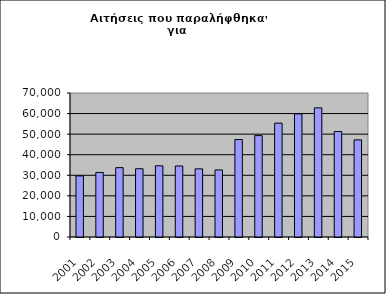
| Category | Series 1 |
|---|---|
| 2001.0 | 29694 |
| 2002.0 | 31386 |
| 2003.0 | 33712 |
| 2004.0 | 33179 |
| 2005.0 | 34612 |
| 2006.0 | 34527 |
| 2007.0 | 33131 |
| 2008.0 | 32607 |
| 2009.0 | 47377 |
| 2010.0 | 49282 |
| 2011.0 | 55358 |
| 2012.0 | 59832 |
| 2013.0 | 62771 |
| 2014.0 | 51290 |
| 2015.0 | 47204 |